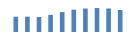
| Category | Exportações (1) |
|---|---|
| 2007.0 | 203692.629 |
| 2008.0 | 204985.899 |
| 2009.0 | 199789.293 |
| 2010.0 | 228223.553 |
| 2011.0 | 265930.688 |